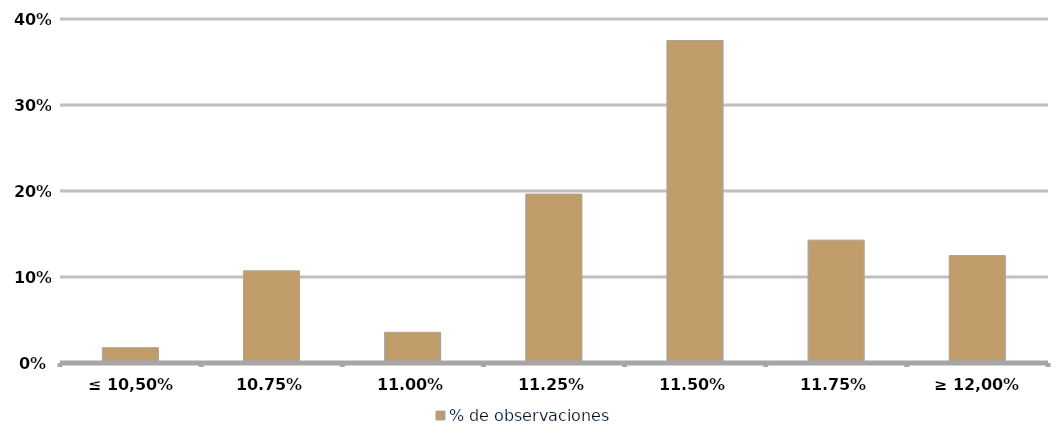
| Category | % de observaciones  |
|---|---|
| ≤ 10,50% | 0.018 |
| 10,75% | 0.107 |
| 11,00% | 0.036 |
| 11,25% | 0.196 |
| 11,50% | 0.375 |
| 11,75% | 0.143 |
| ≥ 12,00% | 0.125 |